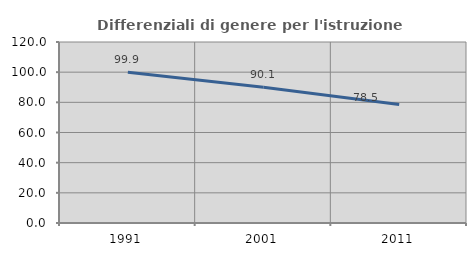
| Category | Differenziali di genere per l'istruzione superiore |
|---|---|
| 1991.0 | 99.921 |
| 2001.0 | 90.057 |
| 2011.0 | 78.532 |